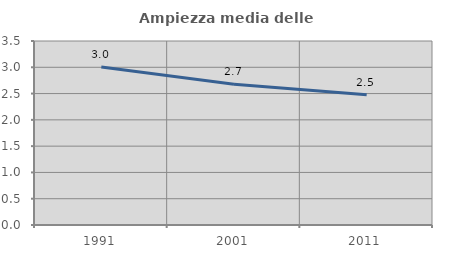
| Category | Ampiezza media delle famiglie |
|---|---|
| 1991.0 | 3.005 |
| 2001.0 | 2.678 |
| 2011.0 | 2.476 |